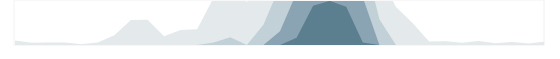
| Category | Бухгалтерия | Series 1 | Series 2 | Series 3 |
|---|---|---|---|---|
| 0.333333333333333 | 75 | 0 | 0 | 0 |
| nan | 37 | 0 | 0 | 0 |
| nan | 42 | 0 | 0 | 0 |
| nan | 43 | 0 | 0 | 0 |
| 0.416666666666667 | 14 | 0 | 0 | 0 |
| nan | 42 | 0 | 0 | 0 |
| nan | 163 | 0 | 0 | 0 |
| nan | 418 | 0 | 0 | 0 |
| 0.5 | 419 | 0 | 0 | 0 |
| nan | 145 | 0 | 0 | 0 |
| nan | 249 | 0 | 0 | 0 |
| nan | 261 | 0 | 0 | 0 |
| 0.583333333333333 | 793 | 43 | 0 | 0 |
| nan | 881 | 131 | 0 | 0 |
| nan | 717 | 0 | 0 | 0 |
| nan | 1089 | 339 | 0 | 0 |
| 0.666666666666667 | 1731 | 981 | 231 | 0 |
| nan | 2369 | 1619 | 869 | 119 |
| nan | 2903 | 2153 | 1403 | 653 |
| nan | 2986 | 2236 | 1486 | 736 |
| 0.75 | 2889 | 2139 | 1389 | 639 |
| nan | 2293 | 1543 | 793 | 43 |
| nan | 1178 | 428 | 0 | 0 |
| nan | 635 | 0 | 0 | 0 |
| 0.833333333333333 | 368 | 0 | 0 | 0 |
| nan | 57 | 0 | 0 | 0 |
| nan | 64 | 0 | 0 | 0 |
| nan | 37 | 0 | 0 | 0 |
| 0.916666666666667 | 67 | 0 | 0 | 0 |
| nan | 29 | 0 | 0 | 0 |
| nan | 50 | 0 | 0 | 0 |
| nan | 26 | 0 | 0 | 0 |
| 0.9993055555555556 | 57 | 0 | 0 | 0 |